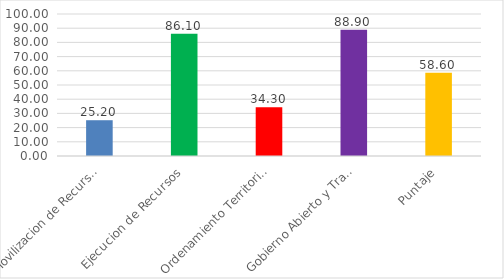
| Category | Series 0 |
|---|---|
| Movilizacion de Recursos | 25.2 |
| Ejecucion de Recursos | 86.1 |
| Ordenamiento Territorial | 34.3 |
| Gobierno Abierto y Transparencia | 88.9 |
| Puntaje | 58.6 |